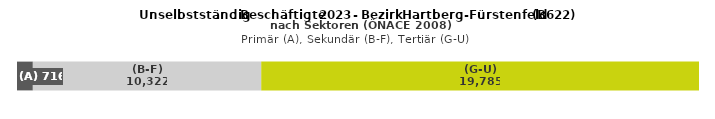
| Category | (A) | (B-F) | (G-U) |
|---|---|---|---|
| 0 | 716 | 10322 | 19785 |